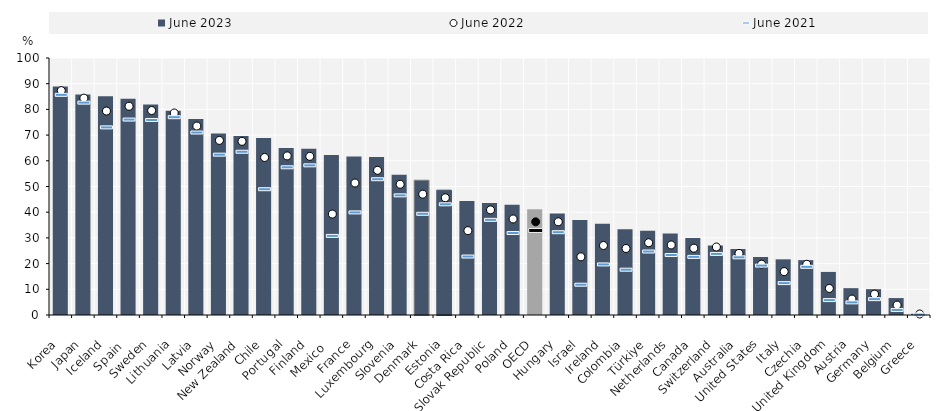
| Category | June 2023 |
|---|---|
| Korea | 88.89 |
| Japan | 85.82 |
| Iceland | 85.09 |
| Spain  | 84.12 |
| Sweden | 81.9 |
| Lithuania | 79.45 |
| Latvia | 76.23 |
| Norway | 70.63 |
| New Zealand | 69.68 |
| Chile | 68.92 |
| Portugal | 65.02 |
| Finland | 64.71 |
| Mexico  | 62.3 |
| France | 61.69 |
| Luxembourg | 61.43 |
| Slovenia | 54.58 |
| Denmark | 52.44 |
| Estonia | 48.57 |
| Costa Rica | 44.38 |
| Slovak Republic | 43.55 |
| Poland | 42.94 |
| OECD | 41.14 |
| Hungary | 39.54 |
| Israel | 36.98 |
| Ireland | 35.53 |
| Colombia | 33.36 |
| Türkiye | 32.79 |
| Netherlands | 31.75 |
| Canada | 30 |
| Switzerland | 27.04 |
| Australia | 25.66 |
| United States | 22.57 |
| Italy | 21.66 |
| Czechia | 21.35 |
| United Kingdom | 16.76 |
| Austria | 10.44 |
| Germany | 10.05 |
| Belgium | 6.59 |
| Greece | 0.48 |